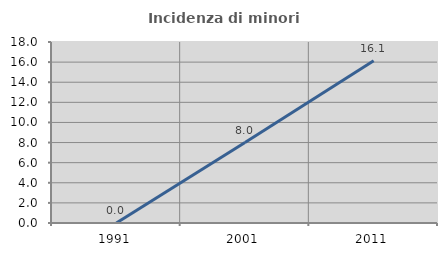
| Category | Incidenza di minori stranieri |
|---|---|
| 1991.0 | 0 |
| 2001.0 | 8 |
| 2011.0 | 16.129 |